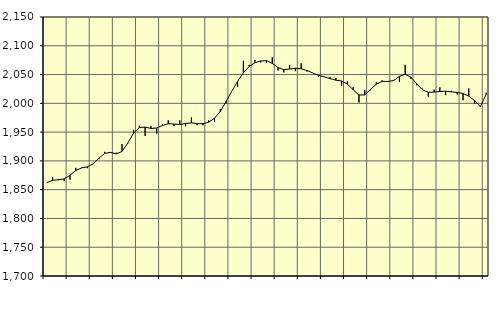
| Category | Piggar | Series 1 |
|---|---|---|
| nan | 1862.1 | 1862.42 |
| 1.0 | 1871.5 | 1866.12 |
| 1.0 | 1866.4 | 1867.33 |
| 1.0 | 1865.5 | 1868.67 |
| nan | 1867.5 | 1875.08 |
| 2.0 | 1887.9 | 1883.27 |
| 2.0 | 1888.2 | 1887.79 |
| 2.0 | 1887.3 | 1889.59 |
| nan | 1894.6 | 1894.94 |
| 3.0 | 1903.5 | 1904.54 |
| 3.0 | 1915.7 | 1913.06 |
| 3.0 | 1915.4 | 1914.78 |
| nan | 1914.2 | 1912.31 |
| 4.0 | 1929.1 | 1916.35 |
| 4.0 | 1930 | 1931.1 |
| 4.0 | 1953.9 | 1948.16 |
| nan | 1961.1 | 1958.06 |
| 5.0 | 1943.3 | 1958.8 |
| 5.0 | 1960.8 | 1956.31 |
| 5.0 | 1947.5 | 1957.27 |
| nan | 1964 | 1961.42 |
| 6.0 | 1970.6 | 1964.5 |
| 6.0 | 1960.9 | 1963.97 |
| 6.0 | 1970.3 | 1962.91 |
| nan | 1960 | 1965.12 |
| 7.0 | 1975.6 | 1965.96 |
| 7.0 | 1962 | 1964.94 |
| 7.0 | 1961.8 | 1964.55 |
| nan | 1970.4 | 1967.24 |
| 8.0 | 1967.4 | 1974.1 |
| 8.0 | 1989.7 | 1985.68 |
| 8.0 | 2000 | 2003.14 |
| nan | 2021 | 2021.08 |
| 9.0 | 2028.8 | 2038.2 |
| 9.0 | 2073.9 | 2053.06 |
| 9.0 | 2066.9 | 2064.12 |
| nan | 2075.5 | 2070.4 |
| 10.0 | 2071.1 | 2073.68 |
| 10.0 | 2070.9 | 2074.13 |
| 10.0 | 2079.8 | 2069.34 |
| nan | 2057.1 | 2062.11 |
| 11.0 | 2053.7 | 2058.58 |
| 11.0 | 2066.8 | 2059.53 |
| 11.0 | 2055.9 | 2060.95 |
| nan | 2069.4 | 2059.96 |
| 12.0 | 2055.4 | 2057.03 |
| 12.0 | 2052.9 | 2052.78 |
| 12.0 | 2045.6 | 2048.59 |
| nan | 2046 | 2046.13 |
| 13.0 | 2045.3 | 2043 |
| 13.0 | 2044 | 2040.29 |
| 13.0 | 2030.5 | 2038.74 |
| nan | 2038.4 | 2033.56 |
| 14.0 | 2028.1 | 2023.48 |
| 14.0 | 2001.6 | 2014.43 |
| 14.0 | 2023.2 | 2014.66 |
| nan | 2022.6 | 2023.91 |
| 15.0 | 2036.5 | 2033.37 |
| 15.0 | 2040.1 | 2038.11 |
| 15.0 | 2037.1 | 2038.03 |
| nan | 2040 | 2039.71 |
| 16.0 | 2037 | 2046.63 |
| 16.0 | 2066.9 | 2050.42 |
| 16.0 | 2042.2 | 2045.36 |
| nan | 2031.5 | 2033.99 |
| 17.0 | 2025.6 | 2023.46 |
| 17.0 | 2011.8 | 2019.22 |
| 17.0 | 2023.8 | 2019.52 |
| nan | 2027.7 | 2020.62 |
| 18.0 | 2014.2 | 2021.07 |
| 18.0 | 2021.6 | 2019.95 |
| 18.0 | 2015.4 | 2018.83 |
| nan | 2005.2 | 2017.1 |
| 19.0 | 2025.8 | 2012.39 |
| 19.0 | 1999.5 | 2004.91 |
| 19.0 | 1995 | 1994.21 |
| nan | 2018.4 | 2015.54 |